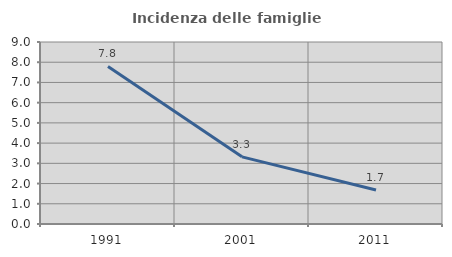
| Category | Incidenza delle famiglie numerose |
|---|---|
| 1991.0 | 7.794 |
| 2001.0 | 3.321 |
| 2011.0 | 1.684 |